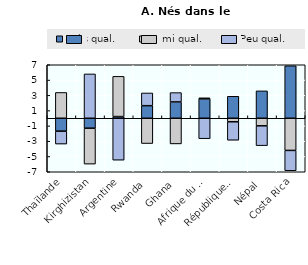
| Category | Très qual. | Semi qual.  | Peu qual.  |
|---|---|---|---|
| Thaïlande | -1.687 | 3.375 | -1.688 |
| Kirghizistan | -1.3 | -4.7 | 5.8 |
| Argentine | 0.217 | 5.266 | -5.483 |
| Rwanda | 1.644 | -3.308 | 1.664 |
| Ghana | 2.136 | -3.358 | 1.222 |
| Afrique du Sud | 2.539 | 0.135 | -2.675 |
| République dominicaine | 2.877 | -0.46 | -2.417 |
| Népal | 3.585 | -0.99 | -2.595 |
| Costa Rica | 6.868 | -4.209 | -2.659 |